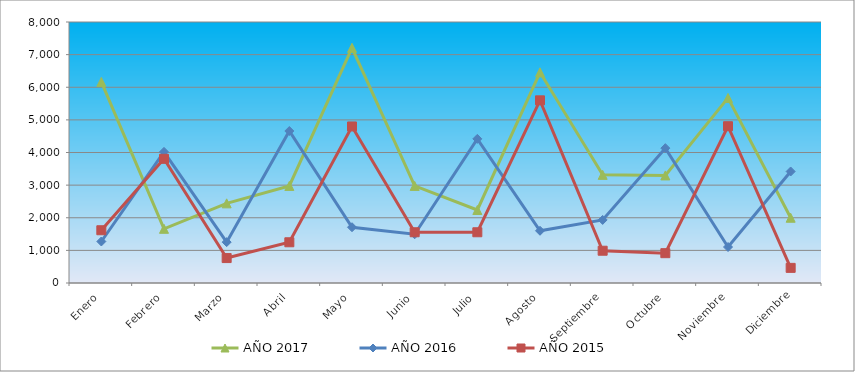
| Category | AÑO 2017 | AÑO 2016 | AÑO 2015 |
|---|---|---|---|
| Enero | 6162.934 | 1272.359 | 1616.882 |
| Febrero | 1661.384 | 4019.476 | 3806.25 |
| Marzo | 2441.217 | 1252.744 | 764.096 |
| Abril | 2975.233 | 4658.965 | 1248.479 |
| Mayo | 7208.086 | 1709.041 | 4798.208 |
| Junio | 2975.233 | 1493.337 | 1555.482 |
| Julio | 2237.782 | 4418.226 | 1555.482 |
| Agosto | 6456.95 | 1601.189 | 5599.111 |
| Septiembre | 3314.291 | 1933.041 | 989.232 |
| Octubre | 3297.338 | 4133.188 | 914.187 |
| Noviembre | 5672.851 | 1103.41 | 4805.211 |
| Diciembre | 2000.441 | 3418.082 | 463.916 |